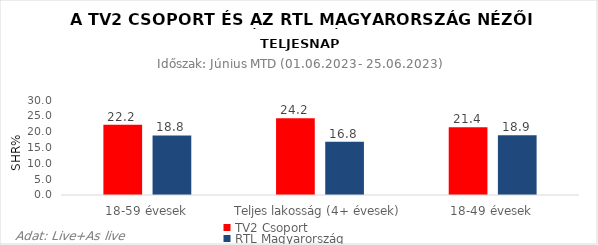
| Category | TV2 Csoport | RTL Magyarország |
|---|---|---|
| 18-59 évesek | 22.2 | 18.8 |
| Teljes lakosság (4+ évesek) | 24.2 | 16.8 |
| 18-49 évesek | 21.4 | 18.9 |